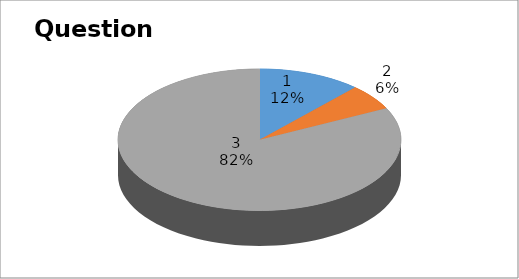
| Category | Series 0 |
|---|---|
| 0 | 2 |
| 1 | 1 |
| 2 | 14 |